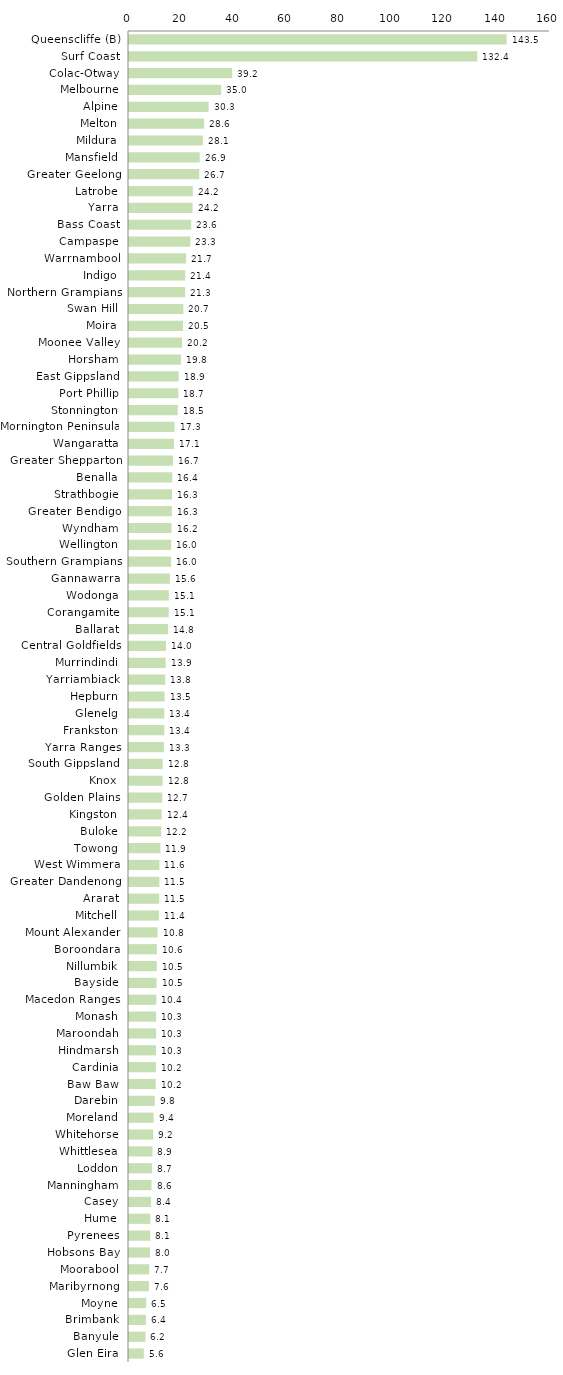
| Category | Series 0 |
|---|---|
| Queenscliffe (B) | 143.516 |
| Surf Coast | 132.361 |
| Colac-Otway | 39.186 |
| Melbourne | 35.036 |
| Alpine | 30.266 |
| Melton | 28.558 |
| Mildura | 28.079 |
| Mansfield | 26.893 |
| Greater Geelong | 26.712 |
| Latrobe | 24.246 |
| Yarra | 24.155 |
| Bass Coast | 23.644 |
| Campaspe | 23.346 |
| Warrnambool | 21.697 |
| Indigo | 21.378 |
| Northern Grampians | 21.34 |
| Swan Hill | 20.67 |
| Moira | 20.535 |
| Moonee Valley | 20.175 |
| Horsham | 19.787 |
| East Gippsland | 18.859 |
| Port Phillip | 18.731 |
| Stonnington | 18.534 |
| Mornington Peninsula | 17.318 |
| Wangaratta | 17.085 |
| Greater Shepparton | 16.702 |
| Benalla | 16.436 |
| Strathbogie | 16.338 |
| Greater Bendigo | 16.303 |
| Wyndham | 16.172 |
| Wellington | 16.021 |
| Southern Grampians | 15.995 |
| Gannawarra | 15.556 |
| Wodonga | 15.14 |
| Corangamite | 15.086 |
| Ballarat | 14.818 |
| Central Goldfields | 14.04 |
| Murrindindi | 13.927 |
| Yarriambiack | 13.778 |
| Hepburn | 13.511 |
| Glenelg | 13.434 |
| Frankston | 13.424 |
| Yarra Ranges | 13.264 |
| South Gippsland | 12.773 |
| Knox | 12.76 |
| Golden Plains | 12.658 |
| Kingston | 12.405 |
| Buloke | 12.239 |
| Towong | 11.927 |
| West Wimmera | 11.553 |
| Greater Dandenong | 11.534 |
| Ararat | 11.489 |
| Mitchell | 11.364 |
| Mount Alexander | 10.845 |
| Boroondara | 10.588 |
| Nillumbik | 10.545 |
| Bayside | 10.484 |
| Macedon Ranges | 10.374 |
| Monash | 10.33 |
| Maroondah | 10.299 |
| Hindmarsh | 10.285 |
| Cardinia | 10.206 |
| Baw Baw | 10.161 |
| Darebin | 9.792 |
| Moreland | 9.357 |
| Whitehorse | 9.198 |
| Whittlesea | 8.928 |
| Loddon | 8.713 |
| Manningham | 8.564 |
| Casey | 8.397 |
| Hume | 8.072 |
| Pyrenees | 8.054 |
| Hobsons Bay | 7.993 |
| Moorabool | 7.694 |
| Maribyrnong | 7.569 |
| Moyne | 6.532 |
| Brimbank | 6.446 |
| Banyule | 6.224 |
| Glen Eira | 5.631 |